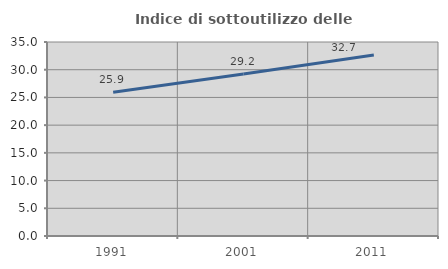
| Category | Indice di sottoutilizzo delle abitazioni  |
|---|---|
| 1991.0 | 25.933 |
| 2001.0 | 29.239 |
| 2011.0 | 32.67 |